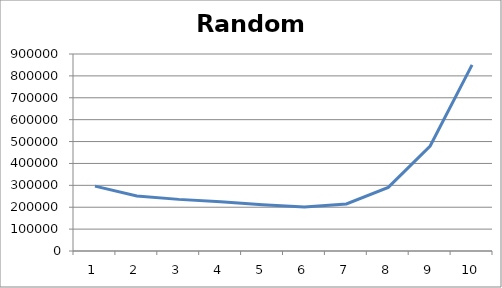
| Category | Random Quadratic |
|---|---|
| 0 | 296504 |
| 1 | 251507.75 |
| 2 | 235842.08 |
| 3 | 225508.07 |
| 4 | 211734.08 |
| 5 | 200975.75 |
| 6 | 214916 |
| 7 | 290465.03 |
| 8 | 479760.32 |
| 9 | 850166.63 |